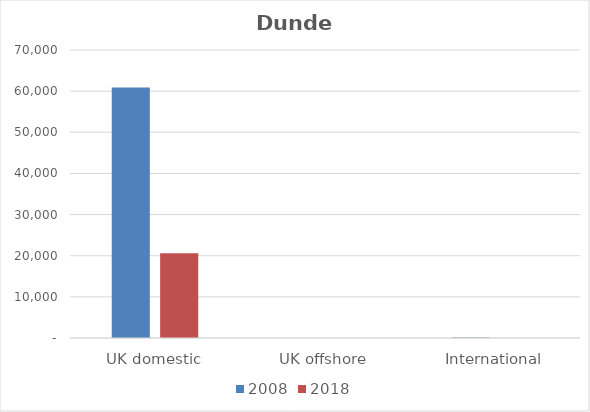
| Category | 2008 | 2018 |
|---|---|---|
| UK domestic | 60866 | 20587 |
| UK offshore | 0 | 0 |
| International | 145 | 0 |